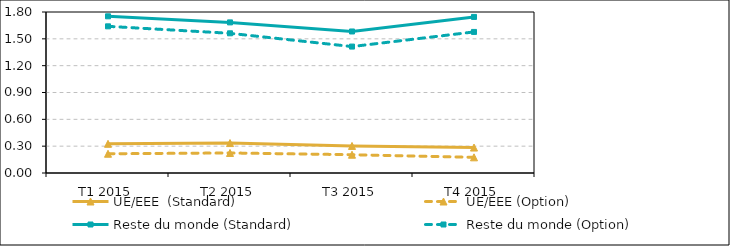
| Category | UE/EEE  (Standard) | UE/EEE (Option) | Reste du monde (Standard) | Reste du monde (Option) |
|---|---|---|---|---|
| T1 2015 | 0.326 | 0.215 | 1.752 | 1.64 |
| T2 2015 | 0.335 | 0.224 | 1.684 | 1.562 |
| T3 2015 | 0.303 | 0.204 | 1.582 | 1.413 |
| T4 2015 | 0.284 | 0.175 | 1.745 | 1.577 |